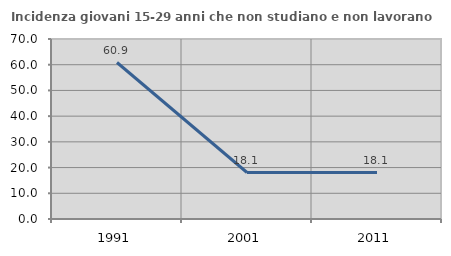
| Category | Incidenza giovani 15-29 anni che non studiano e non lavorano  |
|---|---|
| 1991.0 | 60.859 |
| 2001.0 | 18.077 |
| 2011.0 | 18.072 |